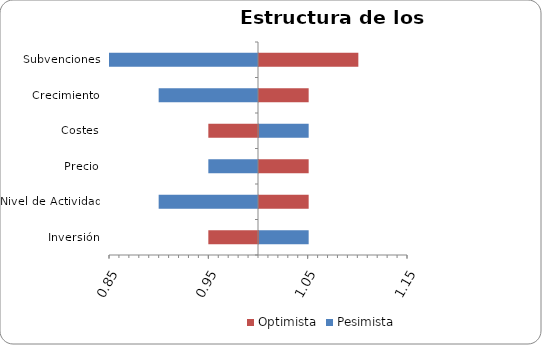
| Category | Pesimista | Optimista |
|---|---|---|
| Inversión | 1.05 | 0.95 |
| Nivel de Actividad | 0.9 | 1.05 |
| Precio | 0.95 | 1.05 |
| Costes | 1.05 | 0.95 |
| Crecimiento | 0.9 | 1.05 |
| Subvenciones | 0.8 | 1.1 |